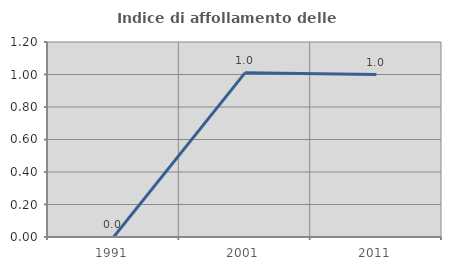
| Category | Indice di affollamento delle abitazioni  |
|---|---|
| 1991.0 | 0 |
| 2001.0 | 1.01 |
| 2011.0 | 1 |